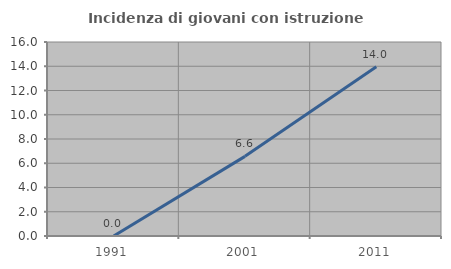
| Category | Incidenza di giovani con istruzione universitaria |
|---|---|
| 1991.0 | 0 |
| 2001.0 | 6.569 |
| 2011.0 | 13.953 |